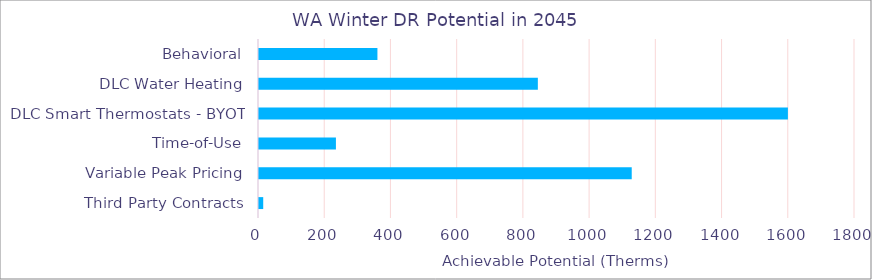
| Category | WA |
|---|---|
| Behavioral | 360.676 |
| DLC Water Heating | 845.176 |
| DLC Smart Thermostats - BYOT | 1600.359 |
| Time-of-Use | 235.33 |
| Variable Peak Pricing | 1128.714 |
| Third Party Contracts | 15.759 |